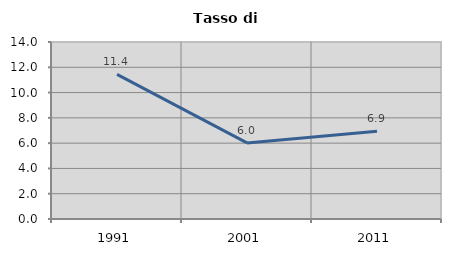
| Category | Tasso di disoccupazione   |
|---|---|
| 1991.0 | 11.438 |
| 2001.0 | 6.017 |
| 2011.0 | 6.949 |